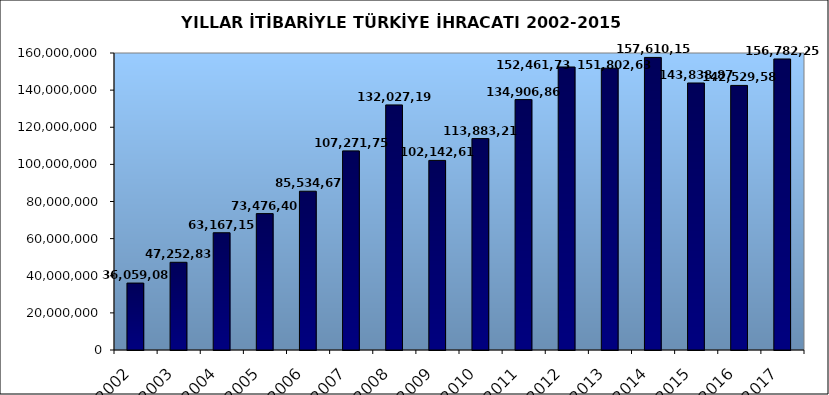
| Category | 2002 |
|---|---|
| 2002.0 | 36059089.029 |
| 2003.0 | 47252836.302 |
| 2004.0 | 63167152.82 |
| 2005.0 | 73476408.143 |
| 2006.0 | 85534675.518 |
| 2007.0 | 107271749.904 |
| 2008.0 | 132027195.626 |
| 2009.0 | 102142612.603 |
| 2010.0 | 113883219.184 |
| 2011.0 | 134906868.83 |
| 2012.0 | 152461736.556 |
| 2013.0 | 151802637.087 |
| 2014.0 | 157610157.69 |
| 2015.0 | 143838871.428 |
| 2016.0 | 142529583.808 |
| 2017.0 | 156782257.017 |